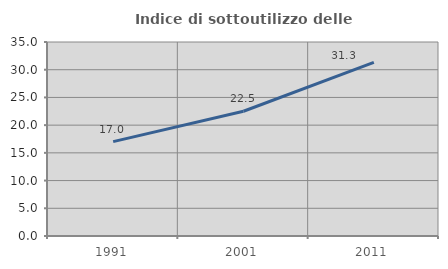
| Category | Indice di sottoutilizzo delle abitazioni  |
|---|---|
| 1991.0 | 17.021 |
| 2001.0 | 22.505 |
| 2011.0 | 31.333 |